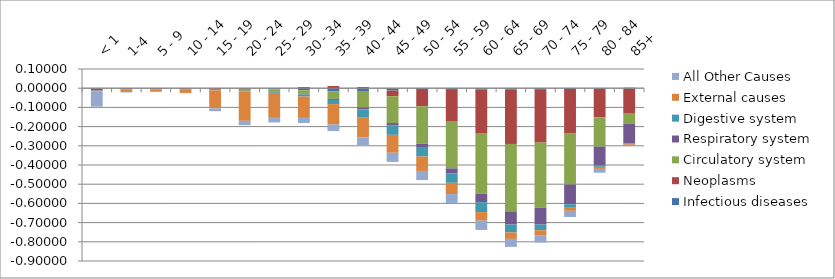
| Category | Infectious diseases  | Neoplasms | Circulatory system | Respiratory system  | Digestive system  | External causes  | All Other Causes |
|---|---|---|---|---|---|---|---|
| < 1 | -0.003 | 0 | -0.001 | -0.009 | 0 | -0.002 | -0.081 |
| 1-4 | -0.002 | -0.004 | -0.001 | -0.002 | 0 | -0.011 | -0.003 |
| 5 - 9 | -0.001 | -0.004 | 0 | 0 | 0 | -0.012 | -0.001 |
| 10 - 14 | -0.001 | -0.003 | 0 | -0.001 | 0 | -0.019 | -0.002 |
| 15 - 19 | -0.001 | -0.007 | -0.002 | -0.001 | 0 | -0.094 | -0.015 |
| 20 - 24 | -0.002 | -0.006 | -0.006 | -0.003 | -0.001 | -0.153 | -0.022 |
| 25 - 29 | -0.005 | -0.001 | -0.011 | -0.003 | -0.004 | -0.13 | -0.024 |
| 30 - 34 | -0.011 | 0.006 | -0.018 | -0.004 | -0.01 | -0.111 | -0.027 |
| 35 - 39 | -0.017 | 0.011 | -0.039 | -0.006 | -0.022 | -0.107 | -0.034 |
| 40 - 44 | -0.015 | 0.006 | -0.086 | -0.01 | -0.041 | -0.105 | -0.044 |
| 45 - 49 | -0.012 | -0.03 | -0.14 | -0.013 | -0.049 | -0.093 | -0.048 |
| 50 - 54 | -0.009 | -0.085 | -0.195 | -0.017 | -0.049 | -0.075 | -0.048 |
| 55 - 59 | -0.009 | -0.162 | -0.247 | -0.027 | -0.048 | -0.058 | -0.046 |
| 60 - 64 | -0.007 | -0.229 | -0.313 | -0.044 | -0.052 | -0.044 | -0.048 |
| 65 - 69 | -0.006 | -0.284 | -0.354 | -0.066 | -0.041 | -0.034 | -0.041 |
| 70 - 74 | -0.005 | -0.278 | -0.339 | -0.087 | -0.03 | -0.026 | -0.038 |
| 75 - 79 | -0.004 | -0.23 | -0.268 | -0.102 | -0.019 | -0.016 | -0.032 |
| 80 - 84 | -0.003 | -0.149 | -0.152 | -0.096 | -0.01 | -0.011 | -0.02 |
| 85+ | -0.002 | -0.127 | -0.057 | -0.101 | -0.005 | -0.007 | 0.005 |